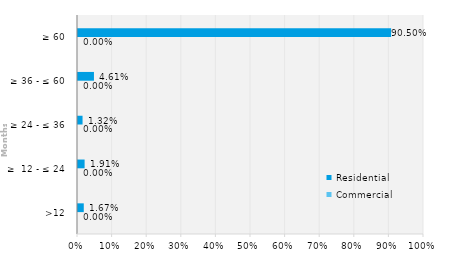
| Category | Commercial | Residential |
|---|---|---|
| >12 | 0 | 0.017 |
| ≥  12 - ≤ 24 | 0 | 0.019 |
| ≥ 24 - ≤ 36 | 0 | 0.013 |
| ≥ 36 - ≤ 60 | 0 | 0.046 |
| ≥ 60 | 0 | 0.905 |